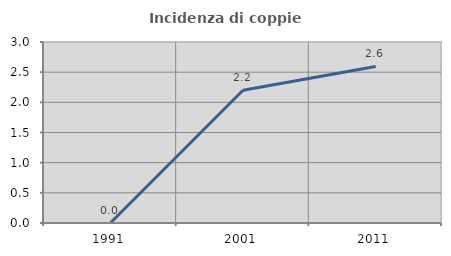
| Category | Incidenza di coppie miste |
|---|---|
| 1991.0 | 0 |
| 2001.0 | 2.2 |
| 2011.0 | 2.594 |